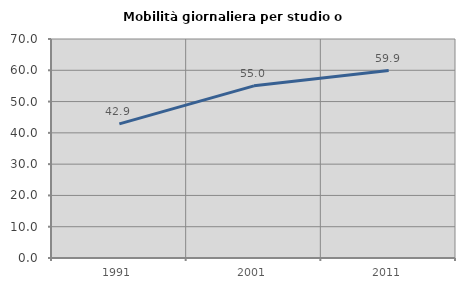
| Category | Mobilità giornaliera per studio o lavoro |
|---|---|
| 1991.0 | 42.868 |
| 2001.0 | 55.026 |
| 2011.0 | 59.905 |